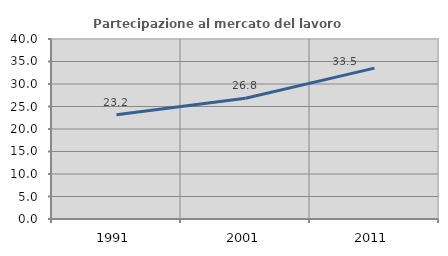
| Category | Partecipazione al mercato del lavoro  femminile |
|---|---|
| 1991.0 | 23.158 |
| 2001.0 | 26.816 |
| 2011.0 | 33.52 |